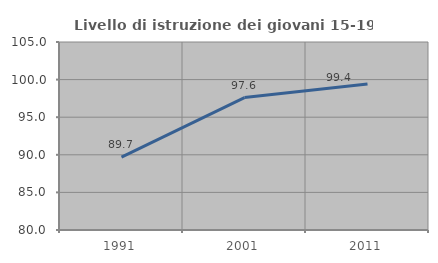
| Category | Livello di istruzione dei giovani 15-19 anni |
|---|---|
| 1991.0 | 89.695 |
| 2001.0 | 97.61 |
| 2011.0 | 99.401 |